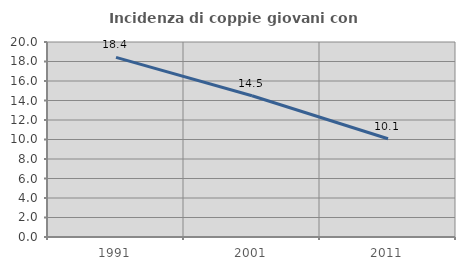
| Category | Incidenza di coppie giovani con figli |
|---|---|
| 1991.0 | 18.421 |
| 2001.0 | 14.484 |
| 2011.0 | 10.075 |